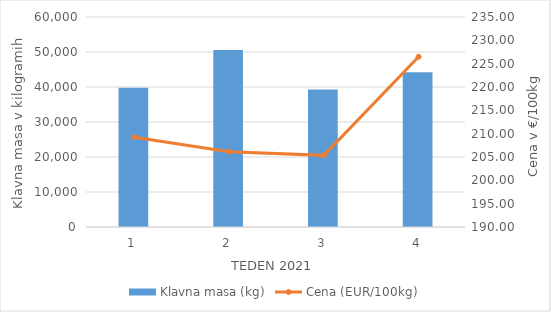
| Category | Klavna masa (kg) |
|---|---|
| 1.0 | 39814 |
| 2.0 | 50603 |
| 3.0 | 39295 |
| 4.0 | 44250 |